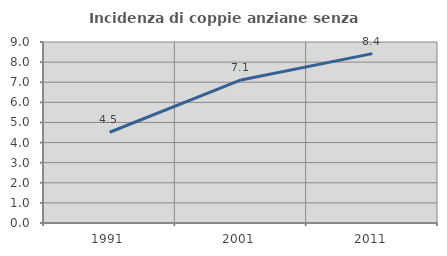
| Category | Incidenza di coppie anziane senza figli  |
|---|---|
| 1991.0 | 4.512 |
| 2001.0 | 7.112 |
| 2011.0 | 8.422 |